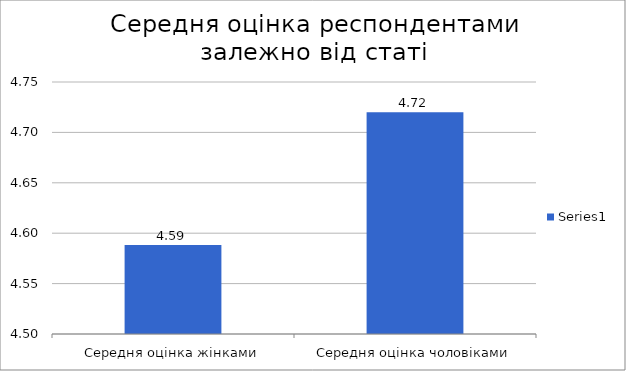
| Category | Series 0 |
|---|---|
| Середня оцінка жінками | 4.588 |
| Середня оцінка чоловіками | 4.72 |